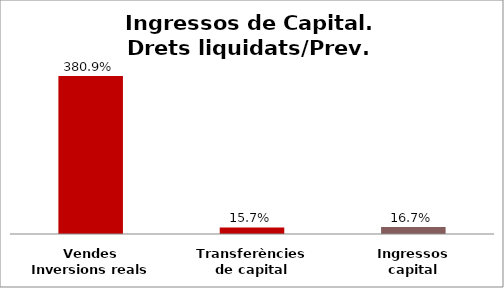
| Category | Series 0 |
|---|---|
| Vendes Inversions reals | 3.809 |
| Transferències de capital | 0.157 |
| Ingressos capital | 0.167 |